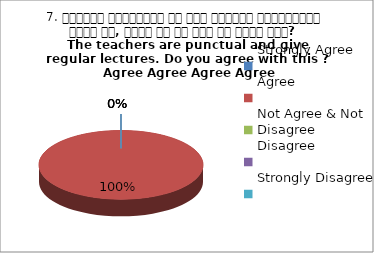
| Category | 7. शिक्षक समयनिष्ट है एवं नियमित व्याख्यान देते है, क्या आप इस बात से सहमत हैं? 
The teachers are punctual and give regular lectures. Do you agree with this ?
 Agree Agree Agree Agree |
|---|---|
| Strongly Agree | 0 |
| Agree | 4 |
| Not Agree & Not Disagree | 0 |
| Disagree | 0 |
| Strongly Disagree | 0 |